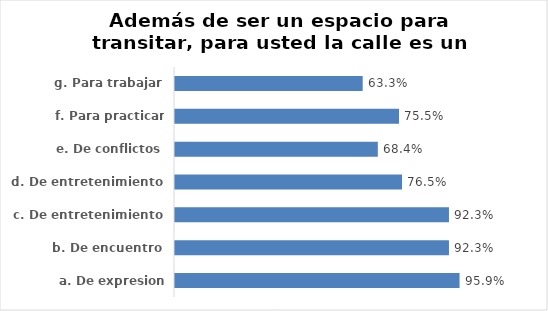
| Category | Series 0 |
|---|---|
| a. De expresion cultural | 0.959 |
| b. De encuentro | 0.923 |
| c. De entretenimiento | 0.923 |
| d. De entretenimiento | 0.765 |
| e. De conflictos | 0.684 |
| f. Para practicar deportes | 0.755 |
| g. Para trabajar | 0.633 |